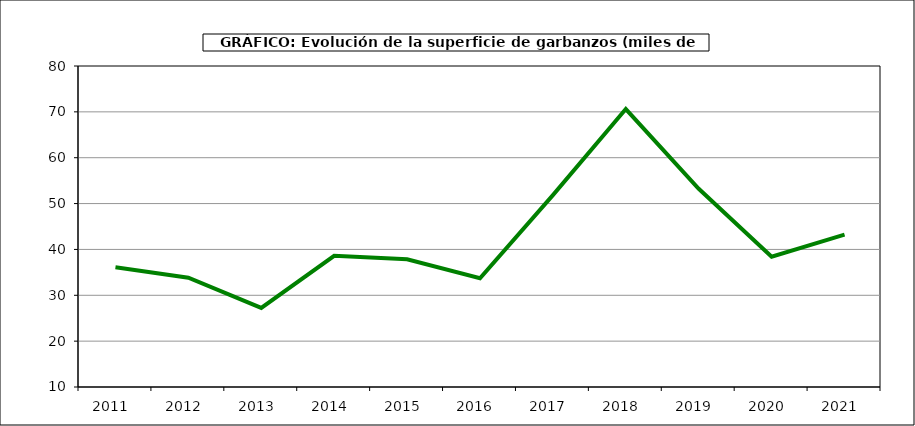
| Category | Superficie |
|---|---|
| 2011.0 | 36.097 |
| 2012.0 | 33.84 |
| 2013.0 | 27.252 |
| 2014.0 | 38.61 |
| 2015.0 | 37.869 |
| 2016.0 | 33.708 |
| 2017.0 | 51.856 |
| 2018.0 | 70.609 |
| 2019.0 | 53.224 |
| 2020.0 | 38.413 |
| 2021.0 | 43.226 |